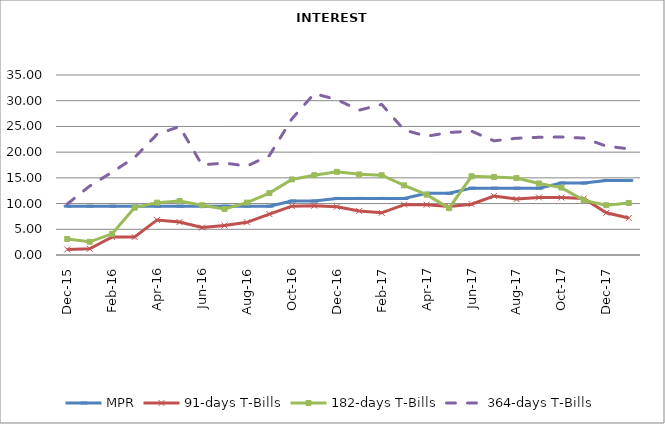
| Category | MPR | 91-days T-Bills | 182-days T-Bills | 364-days T-Bills |
|---|---|---|---|---|
| 2015-12-01 | 9.5 | 1.08 | 3.12 | 9.91 |
| 2016-01-01 | 9.5 | 1.21 | 2.565 | 13.41 |
| 2016-02-01 | 9.5 | 3.505 | 4.12 | 16.115 |
| 2016-03-01 | 9.5 | 3.51 | 9.21 | 18.96 |
| 2016-04-01 | 9.5 | 6.82 | 10.18 | 23.48 |
| 2016-05-01 | 9.5 | 6.41 | 10.49 | 24.97 |
| 2016-06-01 | 9.5 | 5.34 | 9.68 | 17.51 |
| 2016-07-01 | 9.5 | 5.73 | 8.94 | 17.89 |
| 2016-08-01 | 9.5 | 6.355 | 10.185 | 17.29 |
| 2016-09-01 | 9.5 | 7.96 | 12.03 | 19.34 |
| 2016-10-01 | 10.5 | 9.5 | 14.69 | 26.47 |
| 2016-11-01 | 10.5 | 9.59 | 15.52 | 31.38 |
| 2016-12-01 | 11 | 9.38 | 16.17 | 30.22 |
| 2017-01-01 | 11 | 8.57 | 15.68 | 28.16 |
| 2017-02-01 | 11 | 8.2 | 15.51 | 29.29 |
| 2017-03-01 | 11 | 9.79 | 13.54 | 24.31 |
| 2017-04-01 | 12 | 9.78 | 11.73 | 23.09 |
| 2017-05-01 | 12 | 9.43 | 9.11 | 23.82 |
| 2017-06-01 | 13 | 9.88 | 15.31 | 24.08 |
| 2017-07-01 | 13 | 11.46 | 15.18 | 22.2 |
| 2017-08-01 | 13 | 10.87 | 14.97 | 22.7 |
| 2017-09-01 | 13 | 11.19 | 13.91 | 22.89 |
| 2017-10-01 | 14 | 11.17 | 13.11 | 22.95 |
| 2017-11-01 | 14 | 11.01 | 10.62 | 22.73 |
| 2017-12-01 | 14.5 | 8.22 | 9.68 | 21.17 |
| 2018-01-01 | 14.5 | 7.18 | 10.12 | 20.64 |